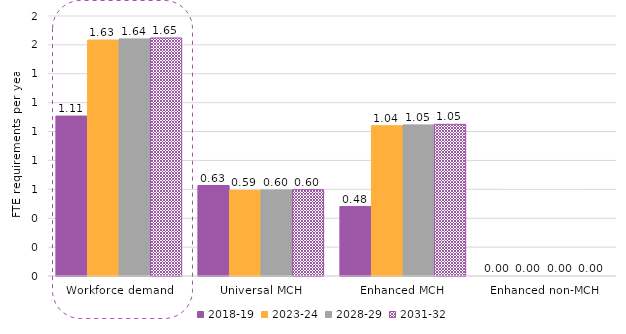
| Category | 2018-19 | 2023-24 | 2028-29 | 2031-32 |
|---|---|---|---|---|
| Workforce demand | 1.107 | 1.633 | 1.642 | 1.648 |
| Universal MCH | 0.626 | 0.593 | 0.596 | 0.598 |
| Enhanced MCH | 0.481 | 1.041 | 1.046 | 1.05 |
| Enhanced non-MCH | 0 | 0 | 0 | 0 |